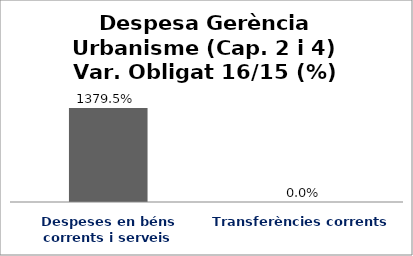
| Category | Series 0 |
|---|---|
| Despeses en béns corrents i serveis | 13.795 |
| Transferències corrents | 0 |